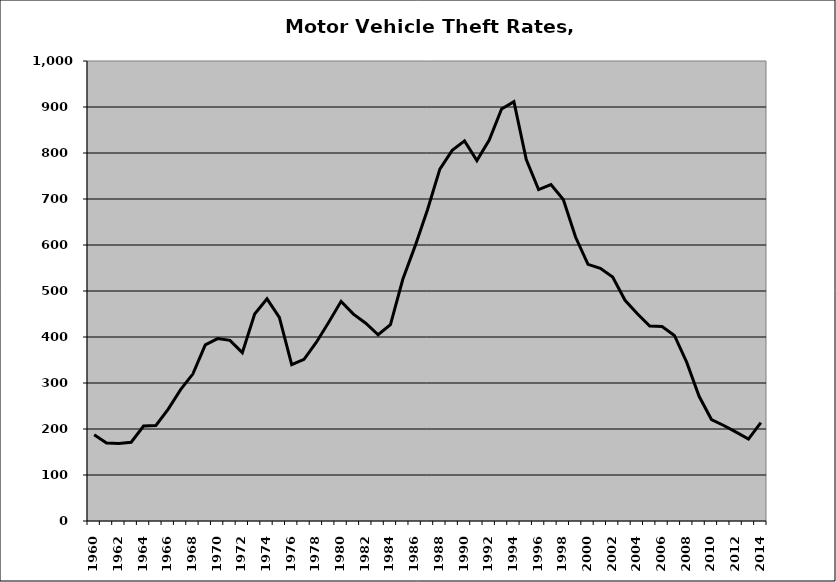
| Category | Motor Vehicle |
|---|---|
| 1960.0 | 187.597 |
| 1961.0 | 169.705 |
| 1962.0 | 168.291 |
| 1963.0 | 171.178 |
| 1964.0 | 206.398 |
| 1965.0 | 207.786 |
| 1966.0 | 243.276 |
| 1967.0 | 285.671 |
| 1968.0 | 319.903 |
| 1969.0 | 382.924 |
| 1970.0 | 396.645 |
| 1971.0 | 392.728 |
| 1972.0 | 366.111 |
| 1973.0 | 449.883 |
| 1974.0 | 482.88 |
| 1975.0 | 442.635 |
| 1976.0 | 339.686 |
| 1977.0 | 351.372 |
| 1978.0 | 388.643 |
| 1979.0 | 432.257 |
| 1980.0 | 477.49 |
| 1981.0 | 449.656 |
| 1982.0 | 429.839 |
| 1983.0 | 404.831 |
| 1984.0 | 426.658 |
| 1985.0 | 525.462 |
| 1986.0 | 598.064 |
| 1987.0 | 676.661 |
| 1988.0 | 765.08 |
| 1989.0 | 805.666 |
| 1990.0 | 826.268 |
| 1991.0 | 783.573 |
| 1992.0 | 828.032 |
| 1993.0 | 895.65 |
| 1994.0 | 911.532 |
| 1995.0 | 785.825 |
| 1996.0 | 720.618 |
| 1997.0 | 731.507 |
| 1998.0 | 698.914 |
| 1999.0 | 616.7 |
| 2000.0 | 557.996 |
| 2001.0 | 549.167 |
| 2002.0 | 530.299 |
| 2003.0 | 479.805 |
| 2004.0 | 450.521 |
| 2005.0 | 423.808 |
| 2006.0 | 422.634 |
| 2007.0 | 403.446 |
| 2008.0 | 344.754 |
| 2009.0 | 271.114 |
| 2010.0 | 220.527 |
| 2011.0 | 207.633 |
| 2012.0 | 193.212 |
| 2013.0 | 178.115 |
| 2014.0 | 214.037 |